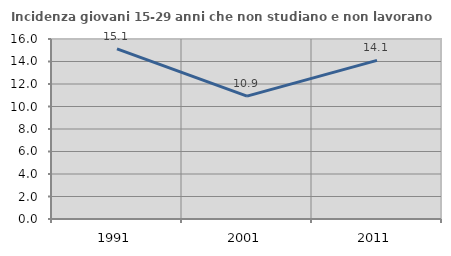
| Category | Incidenza giovani 15-29 anni che non studiano e non lavorano  |
|---|---|
| 1991.0 | 15.121 |
| 2001.0 | 10.925 |
| 2011.0 | 14.103 |